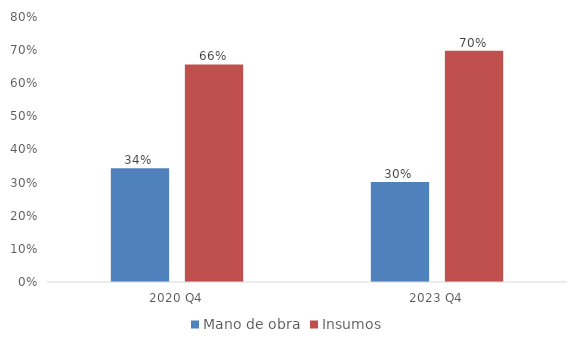
| Category | Mano de obra | Insumos |
|---|---|---|
| 2020 Q4 | 0.343 | 0.657 |
| 2023 Q4 | 0.302 | 0.698 |